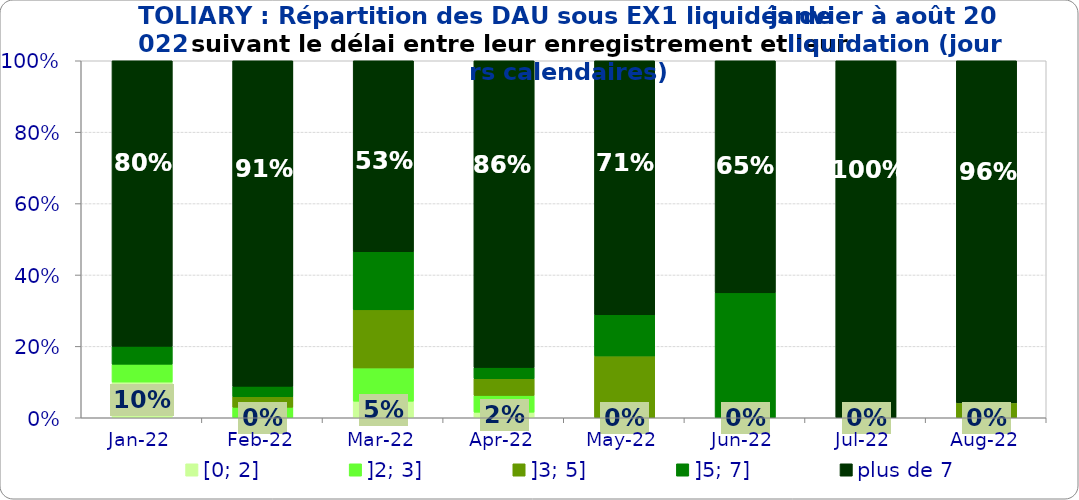
| Category | [0; 2] | ]2; 3] | ]3; 5] | ]5; 7] | plus de 7 |
|---|---|---|---|---|---|
| 2022-01-01 | 0.1 | 0.05 | 0 | 0.05 | 0.8 |
| 2022-02-01 | 0 | 0.029 | 0.029 | 0.029 | 0.912 |
| 2022-03-01 | 0.047 | 0.093 | 0.163 | 0.163 | 0.535 |
| 2022-04-01 | 0.016 | 0.047 | 0.047 | 0.031 | 0.859 |
| 2022-05-01 | 0 | 0 | 0.173 | 0.115 | 0.712 |
| 2022-06-01 | 0 | 0 | 0 | 0.35 | 0.65 |
| 2022-07-01 | 0 | 0 | 0 | 0 | 1 |
| 2022-08-01 | 0 | 0 | 0.042 | 0 | 0.958 |